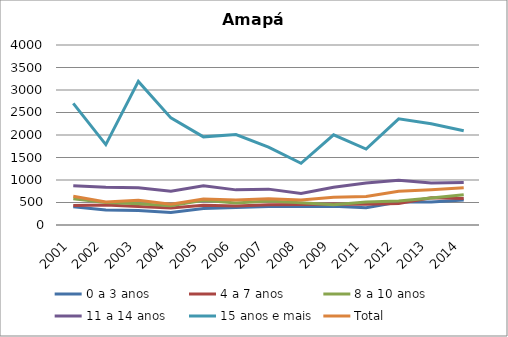
| Category | 0 a 3 anos | 4 a 7 anos | 8 a 10 anos | 11 a 14 anos | 15 anos e mais | Total |
|---|---|---|---|---|---|---|
| 2001.0 | 407.1 | 431.2 | 582.7 | 872.6 | 2702.7 | 639.2 |
| 2002.0 | 334.5 | 442.7 | 501.7 | 837.3 | 1786.4 | 513.9 |
| 2003.0 | 322.5 | 409.7 | 474.9 | 826.7 | 3190.7 | 550.5 |
| 2004.0 | 279.1 | 376.8 | 427.5 | 750.5 | 2380.4 | 463.7 |
| 2005.0 | 368.3 | 437.5 | 549.2 | 870.7 | 1958.8 | 577.6 |
| 2006.0 | 389 | 419.9 | 486.4 | 780.8 | 2011.4 | 555.5 |
| 2007.0 | 412.8 | 450.7 | 533.5 | 797 | 1730.2 | 583.1 |
| 2008.0 | 408.4 | 456.8 | 494.1 | 701.3 | 1371 | 557.4 |
| 2009.0 | 416.5 | 468.6 | 448.8 | 840.5 | 2003.4 | 614.4 |
| 2011.0 | 384.7 | 460.2 | 509 | 934.1 | 1688.7 | 631.8 |
| 2012.0 | 512.7 | 478.1 | 536 | 992.1 | 2360 | 747.6 |
| 2013.0 | 511.7 | 607.8 | 600.8 | 935.9 | 2250.7 | 782.7 |
| 2014.0 | 558.2 | 586.8 | 674.4 | 943.8 | 2092.8 | 828.2 |